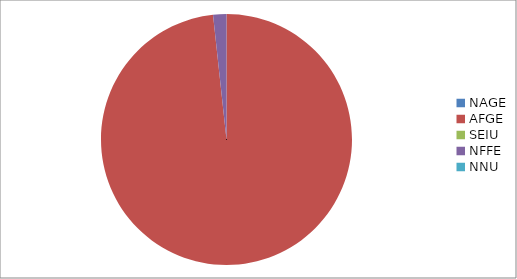
| Category | Series 0 |
|---|---|
| NAGE | 0 |
| AFGE | 9010 |
| SEIU | 0 |
| NFFE | 157 |
| NNU | 0 |